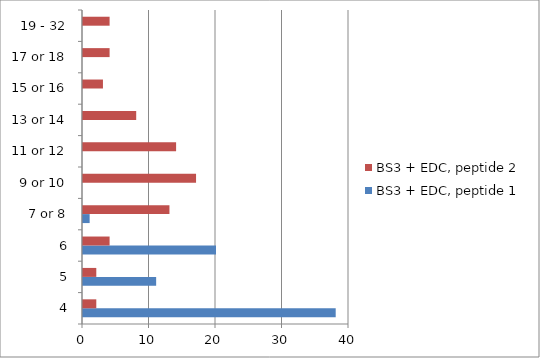
| Category | BS3 + EDC, peptide 1 | BS3 + EDC, peptide 2 |
|---|---|---|
| 4 | 38 | 2 |
| 5 | 11 | 2 |
| 6 | 20 | 4 |
| 7 or 8 | 1 | 13 |
| 9 or 10 | 0 | 17 |
| 11 or 12 | 0 | 14 |
| 13 or 14 | 0 | 8 |
| 15 or 16 | 0 | 3 |
| 17 or 18 | 0 | 4 |
| 19 - 32 | 0 | 4 |